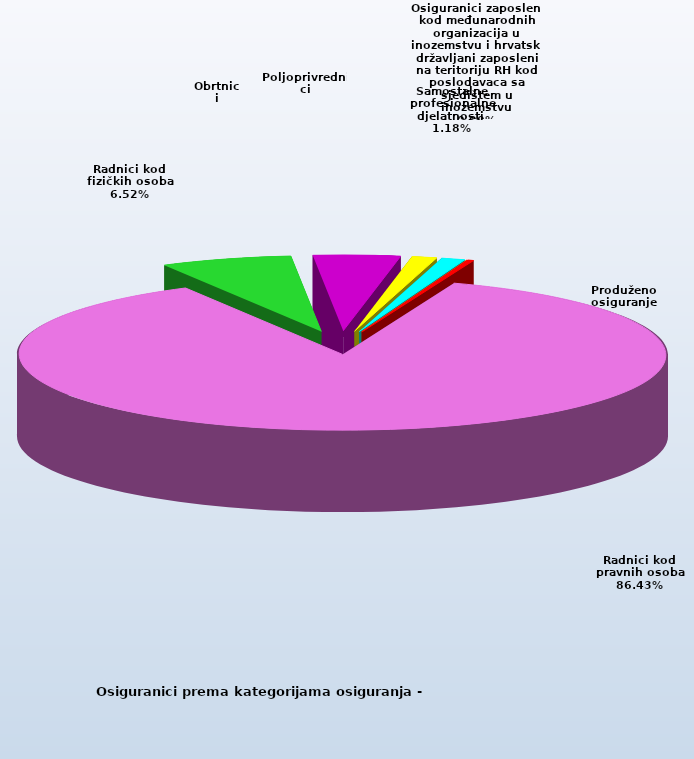
| Category | Series 0 |
|---|---|
| Radnici kod pravnih osoba | 1335862 |
| Radnici kod fizičkih osoba | 100750 |
| Obrtnici | 66754 |
| Poljoprivrednici | 19199 |
| Samostalne profesionalne djelatnosti  | 18184 |
| Osiguranici zaposleni kod međunarodnih organizacija u inozemstvu i hrvatski državljani zaposleni na teritoriju RH kod poslodavaca sa sjedištem u inozemstvu | 69 |
| Produženo osiguranje | 4748 |